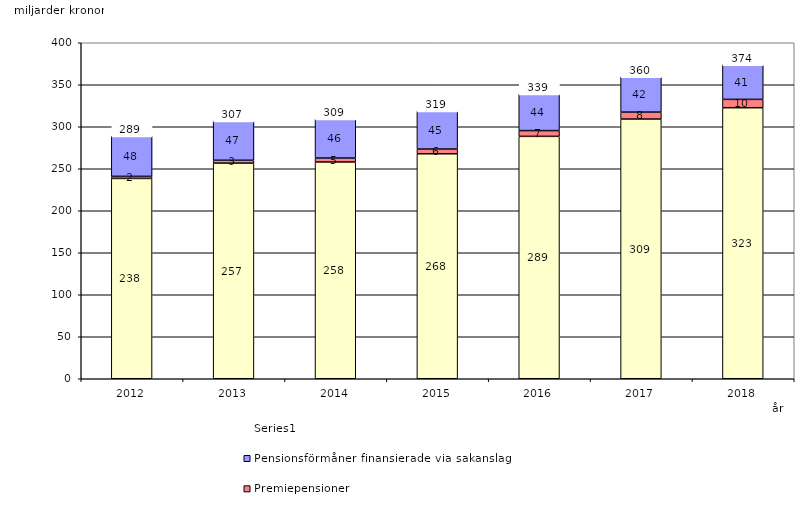
| Category | Inkomstpension och tilläggspension m.m. | Premiepensioner | Pensionsförmåner finansierade via sakanslag | Series 0 |
|---|---|---|---|---|
| 2012.0 | 238.478 | 2.465 | 48.024 | 20 |
| 2013.0 | 256.702 | 3.406 | 46.818 | 20 |
| 2014.0 | 258.052 | 4.716 | 46.312 | 20 |
| 2015.0 | 267.831 | 5.628 | 45.257 | 20 |
| 2016.0 | 288.564 | 6.866 | 43.584 | 20 |
| 2017.0 | 309.181 | 8.271 | 42.174 | 20 |
| 2018.0 | 322.662 | 9.93 | 41.296 | 20 |